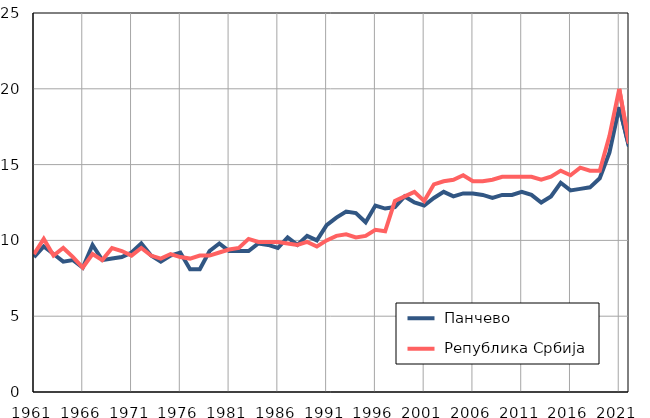
| Category |  Панчево |  Република Србија |
|---|---|---|
| 1961.0 | 8.9 | 9.1 |
| 1962.0 | 9.6 | 10.1 |
| 1963.0 | 9.1 | 9 |
| 1964.0 | 8.6 | 9.5 |
| 1965.0 | 8.7 | 8.9 |
| 1966.0 | 8.2 | 8.2 |
| 1967.0 | 9.7 | 9.1 |
| 1968.0 | 8.7 | 8.7 |
| 1969.0 | 8.8 | 9.5 |
| 1970.0 | 8.9 | 9.3 |
| 1971.0 | 9.2 | 9 |
| 1972.0 | 9.8 | 9.5 |
| 1973.0 | 9 | 9 |
| 1974.0 | 8.6 | 8.8 |
| 1975.0 | 9 | 9.1 |
| 1976.0 | 9.2 | 8.9 |
| 1977.0 | 8.1 | 8.8 |
| 1978.0 | 8.1 | 9 |
| 1979.0 | 9.3 | 9 |
| 1980.0 | 9.8 | 9.2 |
| 1981.0 | 9.3 | 9.4 |
| 1982.0 | 9.3 | 9.5 |
| 1983.0 | 9.3 | 10.1 |
| 1984.0 | 9.8 | 9.9 |
| 1985.0 | 9.7 | 9.9 |
| 1986.0 | 9.5 | 9.9 |
| 1987.0 | 10.2 | 9.8 |
| 1988.0 | 9.7 | 9.7 |
| 1989.0 | 10.3 | 9.9 |
| 1990.0 | 10 | 9.6 |
| 1991.0 | 11 | 10 |
| 1992.0 | 11.5 | 10.3 |
| 1993.0 | 11.9 | 10.4 |
| 1994.0 | 11.8 | 10.2 |
| 1995.0 | 11.2 | 10.3 |
| 1996.0 | 12.3 | 10.7 |
| 1997.0 | 12.1 | 10.6 |
| 1998.0 | 12.2 | 12.6 |
| 1999.0 | 12.9 | 12.9 |
| 2000.0 | 12.5 | 13.2 |
| 2001.0 | 12.3 | 12.6 |
| 2002.0 | 12.8 | 13.7 |
| 2003.0 | 13.2 | 13.9 |
| 2004.0 | 12.9 | 14 |
| 2005.0 | 13.1 | 14.3 |
| 2006.0 | 13.1 | 13.9 |
| 2007.0 | 13 | 13.9 |
| 2008.0 | 12.8 | 14 |
| 2009.0 | 13 | 14.2 |
| 2010.0 | 13 | 14.2 |
| 2011.0 | 13.2 | 14.2 |
| 2012.0 | 13 | 14.2 |
| 2013.0 | 12.5 | 14 |
| 2014.0 | 12.9 | 14.2 |
| 2015.0 | 13.8 | 14.6 |
| 2016.0 | 13.3 | 14.3 |
| 2017.0 | 13.4 | 14.8 |
| 2018.0 | 13.5 | 14.6 |
| 2019.0 | 14.1 | 14.6 |
| 2020.0 | 15.8 | 16.9 |
| 2021.0 | 18.8 | 20 |
| 2022.0 | 16.2 | 16.4 |